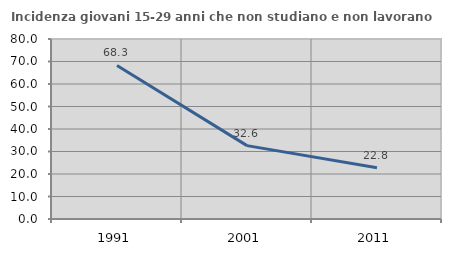
| Category | Incidenza giovani 15-29 anni che non studiano e non lavorano  |
|---|---|
| 1991.0 | 68.261 |
| 2001.0 | 32.609 |
| 2011.0 | 22.8 |